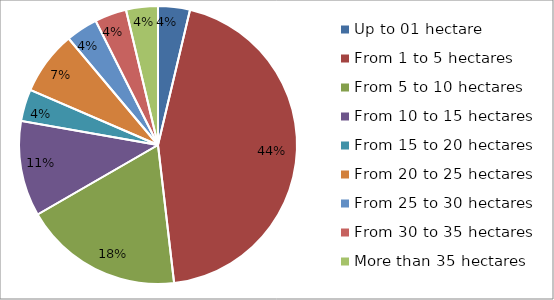
| Category | Series 0 |
|---|---|
| Up to 01 hectare | 1 |
| From 1 to 5 hectares | 12 |
| From 5 to 10 hectares | 5 |
| From 10 to 15 hectares | 3 |
| From 15 to 20 hectares | 1 |
| From 20 to 25 hectares | 2 |
| From 25 to 30 hectares | 1 |
| From 30 to 35 hectares | 1 |
| More than 35 hectares | 1 |